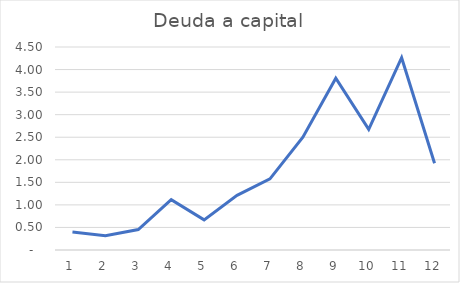
| Category | Series 0 |
|---|---|
| 0 | 0.4 |
| 1 | 0.317 |
| 2 | 0.454 |
| 3 | 1.116 |
| 4 | 0.667 |
| 5 | 1.211 |
| 6 | 1.577 |
| 7 | 2.501 |
| 8 | 3.809 |
| 9 | 2.676 |
| 10 | 4.263 |
| 11 | 1.922 |